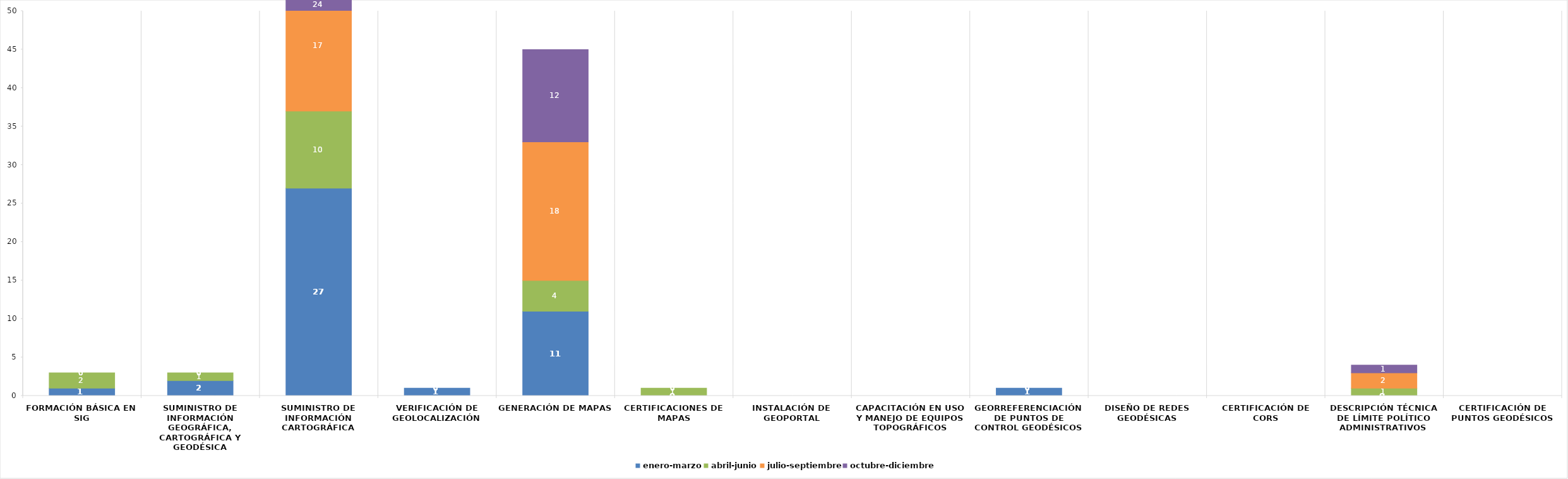
| Category | enero-marzo | abril-junio | julio-septiembre | octubre-diciembre |
|---|---|---|---|---|
| Formación básica en SIG | 1 | 2 | 0 | 0 |
| Suministro de información geográfica, cartográfica y geodésica | 2 | 1 | 0 | 0 |
| Suministro de información cartográfica | 27 | 10 | 17 | 24 |
| Verificación de geolocalización | 1 | 0 | 0 | 0 |
| Generación de mapas | 11 | 4 | 18 | 12 |
| Certificaciones de mapas | 0 | 1 | 0 | 0 |
| Instalación de Geoportal | 0 | 0 | 0 | 0 |
| Capacitación en uso y manejo de equipos topográficos | 0 | 0 | 0 | 0 |
| Georreferenciación de puntos de control geodésicos | 1 | 0 | 0 | 0 |
| Diseño de Redes Geodésicas | 0 | 0 | 0 | 0 |
| Certificación de CORS | 0 | 0 | 0 | 0 |
| Descripción técnica de límite político administrativos | 0 | 1 | 2 | 1 |
| Certificación de puntos geodésicos | 0 | 0 | 0 | 0 |